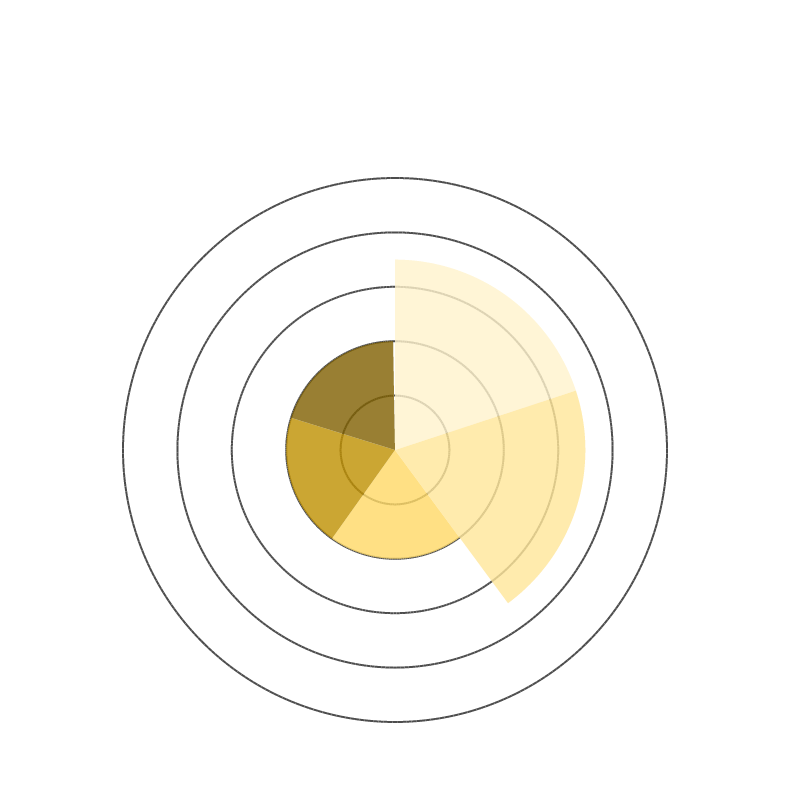
| Category | Biogasproductie | Groengasproductie | Gas-aansluiting | Spui/Affakkeling | Gasopslag |
|---|---|---|---|---|---|
| 0 | 7 | 0 | 0 | 0 | 0 |
| 1 | 7 | 0 | 0 | 0 | 0 |
| 2 | 7 | 0 | 0 | 0 | 0 |
| 3 | 7 | 0 | 0 | 0 | 0 |
| 4 | 7 | 0 | 0 | 0 | 0 |
| 5 | 7 | 0 | 0 | 0 | 0 |
| 6 | 7 | 0 | 0 | 0 | 0 |
| 7 | 7 | 0 | 0 | 0 | 0 |
| 8 | 7 | 0 | 0 | 0 | 0 |
| 9 | 7 | 0 | 0 | 0 | 0 |
| 10 | 7 | 0 | 0 | 0 | 0 |
| 11 | 7 | 0 | 0 | 0 | 0 |
| 12 | 7 | 0 | 0 | 0 | 0 |
| 13 | 7 | 0 | 0 | 0 | 0 |
| 14 | 7 | 0 | 0 | 0 | 0 |
| 15 | 7 | 0 | 0 | 0 | 0 |
| 16 | 7 | 0 | 0 | 0 | 0 |
| 17 | 7 | 0 | 0 | 0 | 0 |
| 18 | 7 | 0 | 0 | 0 | 0 |
| 19 | 7 | 0 | 0 | 0 | 0 |
| 20 | 7 | 0 | 0 | 0 | 0 |
| 21 | 7 | 0 | 0 | 0 | 0 |
| 22 | 7 | 0 | 0 | 0 | 0 |
| 23 | 7 | 0 | 0 | 0 | 0 |
| 24 | 7 | 0 | 0 | 0 | 0 |
| 25 | 7 | 0 | 0 | 0 | 0 |
| 26 | 7 | 0 | 0 | 0 | 0 |
| 27 | 7 | 0 | 0 | 0 | 0 |
| 28 | 7 | 0 | 0 | 0 | 0 |
| 29 | 7 | 0 | 0 | 0 | 0 |
| 30 | 7 | 0 | 0 | 0 | 0 |
| 31 | 7 | 0 | 0 | 0 | 0 |
| 32 | 7 | 0 | 0 | 0 | 0 |
| 33 | 7 | 0 | 0 | 0 | 0 |
| 34 | 7 | 0 | 0 | 0 | 0 |
| 35 | 7 | 0 | 0 | 0 | 0 |
| 36 | 7 | 0 | 0 | 0 | 0 |
| 37 | 7 | 0 | 0 | 0 | 0 |
| 38 | 7 | 0 | 0 | 0 | 0 |
| 39 | 7 | 0 | 0 | 0 | 0 |
| 40 | 7 | 0 | 0 | 0 | 0 |
| 41 | 7 | 0 | 0 | 0 | 0 |
| 42 | 7 | 0 | 0 | 0 | 0 |
| 43 | 7 | 0 | 0 | 0 | 0 |
| 44 | 7 | 0 | 0 | 0 | 0 |
| 45 | 7 | 0 | 0 | 0 | 0 |
| 46 | 7 | 0 | 0 | 0 | 0 |
| 47 | 7 | 0 | 0 | 0 | 0 |
| 48 | 7 | 0 | 0 | 0 | 0 |
| 49 | 7 | 0 | 0 | 0 | 0 |
| 50 | 7 | 0 | 0 | 0 | 0 |
| 51 | 7 | 0 | 0 | 0 | 0 |
| 52 | 7 | 0 | 0 | 0 | 0 |
| 53 | 7 | 0 | 0 | 0 | 0 |
| 54 | 7 | 0 | 0 | 0 | 0 |
| 55 | 7 | 0 | 0 | 0 | 0 |
| 56 | 7 | 0 | 0 | 0 | 0 |
| 57 | 7 | 0 | 0 | 0 | 0 |
| 58 | 7 | 0 | 0 | 0 | 0 |
| 59 | 7 | 0 | 0 | 0 | 0 |
| 60 | 7 | 0 | 0 | 0 | 0 |
| 61 | 7 | 0 | 0 | 0 | 0 |
| 62 | 7 | 0 | 0 | 0 | 0 |
| 63 | 7 | 0 | 0 | 0 | 0 |
| 64 | 7 | 0 | 0 | 0 | 0 |
| 65 | 7 | 0 | 0 | 0 | 0 |
| 66 | 7 | 0 | 0 | 0 | 0 |
| 67 | 7 | 0 | 0 | 0 | 0 |
| 68 | 7 | 0 | 0 | 0 | 0 |
| 69 | 7 | 0 | 0 | 0 | 0 |
| 70 | 7 | 0 | 0 | 0 | 0 |
| 71 | 7 | 0 | 0 | 0 | 0 |
| 72 | 7 | 7 | 0 | 0 | 0 |
| 73 | 0 | 7 | 0 | 0 | 0 |
| 74 | 0 | 7 | 0 | 0 | 0 |
| 75 | 0 | 7 | 0 | 0 | 0 |
| 76 | 0 | 7 | 0 | 0 | 0 |
| 77 | 0 | 7 | 0 | 0 | 0 |
| 78 | 0 | 7 | 0 | 0 | 0 |
| 79 | 0 | 7 | 0 | 0 | 0 |
| 80 | 0 | 7 | 0 | 0 | 0 |
| 81 | 0 | 7 | 0 | 0 | 0 |
| 82 | 0 | 7 | 0 | 0 | 0 |
| 83 | 0 | 7 | 0 | 0 | 0 |
| 84 | 0 | 7 | 0 | 0 | 0 |
| 85 | 0 | 7 | 0 | 0 | 0 |
| 86 | 0 | 7 | 0 | 0 | 0 |
| 87 | 0 | 7 | 0 | 0 | 0 |
| 88 | 0 | 7 | 0 | 0 | 0 |
| 89 | 0 | 7 | 0 | 0 | 0 |
| 90 | 0 | 7 | 0 | 0 | 0 |
| 91 | 0 | 7 | 0 | 0 | 0 |
| 92 | 0 | 7 | 0 | 0 | 0 |
| 93 | 0 | 7 | 0 | 0 | 0 |
| 94 | 0 | 7 | 0 | 0 | 0 |
| 95 | 0 | 7 | 0 | 0 | 0 |
| 96 | 0 | 7 | 0 | 0 | 0 |
| 97 | 0 | 7 | 0 | 0 | 0 |
| 98 | 0 | 7 | 0 | 0 | 0 |
| 99 | 0 | 7 | 0 | 0 | 0 |
| 100 | 0 | 7 | 0 | 0 | 0 |
| 101 | 0 | 7 | 0 | 0 | 0 |
| 102 | 0 | 7 | 0 | 0 | 0 |
| 103 | 0 | 7 | 0 | 0 | 0 |
| 104 | 0 | 7 | 0 | 0 | 0 |
| 105 | 0 | 7 | 0 | 0 | 0 |
| 106 | 0 | 7 | 0 | 0 | 0 |
| 107 | 0 | 7 | 0 | 0 | 0 |
| 108 | 0 | 7 | 0 | 0 | 0 |
| 109 | 0 | 7 | 0 | 0 | 0 |
| 110 | 0 | 7 | 0 | 0 | 0 |
| 111 | 0 | 7 | 0 | 0 | 0 |
| 112 | 0 | 7 | 0 | 0 | 0 |
| 113 | 0 | 7 | 0 | 0 | 0 |
| 114 | 0 | 7 | 0 | 0 | 0 |
| 115 | 0 | 7 | 0 | 0 | 0 |
| 116 | 0 | 7 | 0 | 0 | 0 |
| 117 | 0 | 7 | 0 | 0 | 0 |
| 118 | 0 | 7 | 0 | 0 | 0 |
| 119 | 0 | 7 | 0 | 0 | 0 |
| 120 | 0 | 7 | 0 | 0 | 0 |
| 121 | 0 | 7 | 0 | 0 | 0 |
| 122 | 0 | 7 | 0 | 0 | 0 |
| 123 | 0 | 7 | 0 | 0 | 0 |
| 124 | 0 | 7 | 0 | 0 | 0 |
| 125 | 0 | 7 | 0 | 0 | 0 |
| 126 | 0 | 7 | 0 | 0 | 0 |
| 127 | 0 | 7 | 0 | 0 | 0 |
| 128 | 0 | 7 | 0 | 0 | 0 |
| 129 | 0 | 7 | 0 | 0 | 0 |
| 130 | 0 | 7 | 0 | 0 | 0 |
| 131 | 0 | 7 | 0 | 0 | 0 |
| 132 | 0 | 7 | 0 | 0 | 0 |
| 133 | 0 | 7 | 0 | 0 | 0 |
| 134 | 0 | 7 | 0 | 0 | 0 |
| 135 | 0 | 7 | 0 | 0 | 0 |
| 136 | 0 | 7 | 0 | 0 | 0 |
| 137 | 0 | 7 | 0 | 0 | 0 |
| 138 | 0 | 7 | 0 | 0 | 0 |
| 139 | 0 | 7 | 0 | 0 | 0 |
| 140 | 0 | 7 | 0 | 0 | 0 |
| 141 | 0 | 7 | 0 | 0 | 0 |
| 142 | 0 | 7 | 0 | 0 | 0 |
| 143 | 0 | 7 | 0 | 0 | 0 |
| 144 | 0 | 7 | 4 | 0 | 0 |
| 145 | 0 | 0 | 4 | 0 | 0 |
| 146 | 0 | 0 | 4 | 0 | 0 |
| 147 | 0 | 0 | 4 | 0 | 0 |
| 148 | 0 | 0 | 4 | 0 | 0 |
| 149 | 0 | 0 | 4 | 0 | 0 |
| 150 | 0 | 0 | 4 | 0 | 0 |
| 151 | 0 | 0 | 4 | 0 | 0 |
| 152 | 0 | 0 | 4 | 0 | 0 |
| 153 | 0 | 0 | 4 | 0 | 0 |
| 154 | 0 | 0 | 4 | 0 | 0 |
| 155 | 0 | 0 | 4 | 0 | 0 |
| 156 | 0 | 0 | 4 | 0 | 0 |
| 157 | 0 | 0 | 4 | 0 | 0 |
| 158 | 0 | 0 | 4 | 0 | 0 |
| 159 | 0 | 0 | 4 | 0 | 0 |
| 160 | 0 | 0 | 4 | 0 | 0 |
| 161 | 0 | 0 | 4 | 0 | 0 |
| 162 | 0 | 0 | 4 | 0 | 0 |
| 163 | 0 | 0 | 4 | 0 | 0 |
| 164 | 0 | 0 | 4 | 0 | 0 |
| 165 | 0 | 0 | 4 | 0 | 0 |
| 166 | 0 | 0 | 4 | 0 | 0 |
| 167 | 0 | 0 | 4 | 0 | 0 |
| 168 | 0 | 0 | 4 | 0 | 0 |
| 169 | 0 | 0 | 4 | 0 | 0 |
| 170 | 0 | 0 | 4 | 0 | 0 |
| 171 | 0 | 0 | 4 | 0 | 0 |
| 172 | 0 | 0 | 4 | 0 | 0 |
| 173 | 0 | 0 | 4 | 0 | 0 |
| 174 | 0 | 0 | 4 | 0 | 0 |
| 175 | 0 | 0 | 4 | 0 | 0 |
| 176 | 0 | 0 | 4 | 0 | 0 |
| 177 | 0 | 0 | 4 | 0 | 0 |
| 178 | 0 | 0 | 4 | 0 | 0 |
| 179 | 0 | 0 | 4 | 0 | 0 |
| 180 | 0 | 0 | 4 | 0 | 0 |
| 181 | 0 | 0 | 4 | 0 | 0 |
| 182 | 0 | 0 | 4 | 0 | 0 |
| 183 | 0 | 0 | 4 | 0 | 0 |
| 184 | 0 | 0 | 4 | 0 | 0 |
| 185 | 0 | 0 | 4 | 0 | 0 |
| 186 | 0 | 0 | 4 | 0 | 0 |
| 187 | 0 | 0 | 4 | 0 | 0 |
| 188 | 0 | 0 | 4 | 0 | 0 |
| 189 | 0 | 0 | 4 | 0 | 0 |
| 190 | 0 | 0 | 4 | 0 | 0 |
| 191 | 0 | 0 | 4 | 0 | 0 |
| 192 | 0 | 0 | 4 | 0 | 0 |
| 193 | 0 | 0 | 4 | 0 | 0 |
| 194 | 0 | 0 | 4 | 0 | 0 |
| 195 | 0 | 0 | 4 | 0 | 0 |
| 196 | 0 | 0 | 4 | 0 | 0 |
| 197 | 0 | 0 | 4 | 0 | 0 |
| 198 | 0 | 0 | 4 | 0 | 0 |
| 199 | 0 | 0 | 4 | 0 | 0 |
| 200 | 0 | 0 | 4 | 0 | 0 |
| 201 | 0 | 0 | 4 | 0 | 0 |
| 202 | 0 | 0 | 4 | 0 | 0 |
| 203 | 0 | 0 | 4 | 0 | 0 |
| 204 | 0 | 0 | 4 | 0 | 0 |
| 205 | 0 | 0 | 4 | 0 | 0 |
| 206 | 0 | 0 | 4 | 0 | 0 |
| 207 | 0 | 0 | 4 | 0 | 0 |
| 208 | 0 | 0 | 4 | 0 | 0 |
| 209 | 0 | 0 | 4 | 0 | 0 |
| 210 | 0 | 0 | 4 | 0 | 0 |
| 211 | 0 | 0 | 4 | 0 | 0 |
| 212 | 0 | 0 | 4 | 0 | 0 |
| 213 | 0 | 0 | 4 | 0 | 0 |
| 214 | 0 | 0 | 4 | 0 | 0 |
| 215 | 0 | 0 | 4 | 0 | 0 |
| 216 | 0 | 0 | 4 | 4 | 0 |
| 217 | 0 | 0 | 0 | 4 | 0 |
| 218 | 0 | 0 | 0 | 4 | 0 |
| 219 | 0 | 0 | 0 | 4 | 0 |
| 220 | 0 | 0 | 0 | 4 | 0 |
| 221 | 0 | 0 | 0 | 4 | 0 |
| 222 | 0 | 0 | 0 | 4 | 0 |
| 223 | 0 | 0 | 0 | 4 | 0 |
| 224 | 0 | 0 | 0 | 4 | 0 |
| 225 | 0 | 0 | 0 | 4 | 0 |
| 226 | 0 | 0 | 0 | 4 | 0 |
| 227 | 0 | 0 | 0 | 4 | 0 |
| 228 | 0 | 0 | 0 | 4 | 0 |
| 229 | 0 | 0 | 0 | 4 | 0 |
| 230 | 0 | 0 | 0 | 4 | 0 |
| 231 | 0 | 0 | 0 | 4 | 0 |
| 232 | 0 | 0 | 0 | 4 | 0 |
| 233 | 0 | 0 | 0 | 4 | 0 |
| 234 | 0 | 0 | 0 | 4 | 0 |
| 235 | 0 | 0 | 0 | 4 | 0 |
| 236 | 0 | 0 | 0 | 4 | 0 |
| 237 | 0 | 0 | 0 | 4 | 0 |
| 238 | 0 | 0 | 0 | 4 | 0 |
| 239 | 0 | 0 | 0 | 4 | 0 |
| 240 | 0 | 0 | 0 | 4 | 0 |
| 241 | 0 | 0 | 0 | 4 | 0 |
| 242 | 0 | 0 | 0 | 4 | 0 |
| 243 | 0 | 0 | 0 | 4 | 0 |
| 244 | 0 | 0 | 0 | 4 | 0 |
| 245 | 0 | 0 | 0 | 4 | 0 |
| 246 | 0 | 0 | 0 | 4 | 0 |
| 247 | 0 | 0 | 0 | 4 | 0 |
| 248 | 0 | 0 | 0 | 4 | 0 |
| 249 | 0 | 0 | 0 | 4 | 0 |
| 250 | 0 | 0 | 0 | 4 | 0 |
| 251 | 0 | 0 | 0 | 4 | 0 |
| 252 | 0 | 0 | 0 | 4 | 0 |
| 253 | 0 | 0 | 0 | 4 | 0 |
| 254 | 0 | 0 | 0 | 4 | 0 |
| 255 | 0 | 0 | 0 | 4 | 0 |
| 256 | 0 | 0 | 0 | 4 | 0 |
| 257 | 0 | 0 | 0 | 4 | 0 |
| 258 | 0 | 0 | 0 | 4 | 0 |
| 259 | 0 | 0 | 0 | 4 | 0 |
| 260 | 0 | 0 | 0 | 4 | 0 |
| 261 | 0 | 0 | 0 | 4 | 0 |
| 262 | 0 | 0 | 0 | 4 | 0 |
| 263 | 0 | 0 | 0 | 4 | 0 |
| 264 | 0 | 0 | 0 | 4 | 0 |
| 265 | 0 | 0 | 0 | 4 | 0 |
| 266 | 0 | 0 | 0 | 4 | 0 |
| 267 | 0 | 0 | 0 | 4 | 0 |
| 268 | 0 | 0 | 0 | 4 | 0 |
| 269 | 0 | 0 | 0 | 4 | 0 |
| 270 | 0 | 0 | 0 | 4 | 0 |
| 271 | 0 | 0 | 0 | 4 | 0 |
| 272 | 0 | 0 | 0 | 4 | 0 |
| 273 | 0 | 0 | 0 | 4 | 0 |
| 274 | 0 | 0 | 0 | 4 | 0 |
| 275 | 0 | 0 | 0 | 4 | 0 |
| 276 | 0 | 0 | 0 | 4 | 0 |
| 277 | 0 | 0 | 0 | 4 | 0 |
| 278 | 0 | 0 | 0 | 4 | 0 |
| 279 | 0 | 0 | 0 | 4 | 0 |
| 280 | 0 | 0 | 0 | 4 | 0 |
| 281 | 0 | 0 | 0 | 4 | 0 |
| 282 | 0 | 0 | 0 | 4 | 0 |
| 283 | 0 | 0 | 0 | 4 | 0 |
| 284 | 0 | 0 | 0 | 4 | 0 |
| 285 | 0 | 0 | 0 | 4 | 0 |
| 286 | 0 | 0 | 0 | 4 | 0 |
| 287 | 0 | 0 | 0 | 4 | 0 |
| 288 | 0 | 0 | 0 | 4 | 0 |
| 289 | 0 | 0 | 0 | 0 | 0 |
| 290 | 0 | 0 | 0 | 0 | 0 |
| 291 | 0 | 0 | 0 | 0 | 0 |
| 292 | 0 | 0 | 0 | 0 | 0 |
| 293 | 0 | 0 | 0 | 0 | 0 |
| 294 | 0 | 0 | 0 | 0 | 0 |
| 295 | 0 | 0 | 0 | 0 | 0 |
| 296 | 0 | 0 | 0 | 0 | 0 |
| 297 | 0 | 0 | 0 | 0 | 0 |
| 298 | 0 | 0 | 0 | 0 | 0 |
| 299 | 0 | 0 | 0 | 0 | 0 |
| 300 | 0 | 0 | 0 | 0 | 0 |
| 301 | 0 | 0 | 0 | 0 | 0 |
| 302 | 0 | 0 | 0 | 0 | 0 |
| 303 | 0 | 0 | 0 | 0 | 0 |
| 304 | 0 | 0 | 0 | 0 | 0 |
| 305 | 0 | 0 | 0 | 0 | 0 |
| 306 | 0 | 0 | 0 | 0 | 0 |
| 307 | 0 | 0 | 0 | 0 | 0 |
| 308 | 0 | 0 | 0 | 0 | 0 |
| 309 | 0 | 0 | 0 | 0 | 0 |
| 310 | 0 | 0 | 0 | 0 | 0 |
| 311 | 0 | 0 | 0 | 0 | 0 |
| 312 | 0 | 0 | 0 | 0 | 0 |
| 313 | 0 | 0 | 0 | 0 | 0 |
| 314 | 0 | 0 | 0 | 0 | 0 |
| 315 | 0 | 0 | 0 | 0 | 0 |
| 316 | 0 | 0 | 0 | 0 | 0 |
| 317 | 0 | 0 | 0 | 0 | 0 |
| 318 | 0 | 0 | 0 | 0 | 0 |
| 319 | 0 | 0 | 0 | 0 | 0 |
| 320 | 0 | 0 | 0 | 0 | 0 |
| 321 | 0 | 0 | 0 | 0 | 0 |
| 322 | 0 | 0 | 0 | 0 | 0 |
| 323 | 0 | 0 | 0 | 0 | 0 |
| 324 | 0 | 0 | 0 | 0 | 0 |
| 325 | 0 | 0 | 0 | 0 | 0 |
| 326 | 0 | 0 | 0 | 0 | 0 |
| 327 | 0 | 0 | 0 | 0 | 0 |
| 328 | 0 | 0 | 0 | 0 | 0 |
| 329 | 0 | 0 | 0 | 0 | 0 |
| 330 | 0 | 0 | 0 | 0 | 0 |
| 331 | 0 | 0 | 0 | 0 | 0 |
| 332 | 0 | 0 | 0 | 0 | 0 |
| 333 | 0 | 0 | 0 | 0 | 0 |
| 334 | 0 | 0 | 0 | 0 | 0 |
| 335 | 0 | 0 | 0 | 0 | 0 |
| 336 | 0 | 0 | 0 | 0 | 0 |
| 337 | 0 | 0 | 0 | 0 | 0 |
| 338 | 0 | 0 | 0 | 0 | 0 |
| 339 | 0 | 0 | 0 | 0 | 0 |
| 340 | 0 | 0 | 0 | 0 | 0 |
| 341 | 0 | 0 | 0 | 0 | 0 |
| 342 | 0 | 0 | 0 | 0 | 0 |
| 343 | 0 | 0 | 0 | 0 | 0 |
| 344 | 0 | 0 | 0 | 0 | 0 |
| 345 | 0 | 0 | 0 | 0 | 0 |
| 346 | 0 | 0 | 0 | 0 | 0 |
| 347 | 0 | 0 | 0 | 0 | 0 |
| 348 | 0 | 0 | 0 | 0 | 0 |
| 349 | 0 | 0 | 0 | 0 | 0 |
| 350 | 0 | 0 | 0 | 0 | 0 |
| 351 | 0 | 0 | 0 | 0 | 0 |
| 352 | 0 | 0 | 0 | 0 | 0 |
| 353 | 0 | 0 | 0 | 0 | 0 |
| 354 | 0 | 0 | 0 | 0 | 0 |
| 355 | 0 | 0 | 0 | 0 | 0 |
| 356 | 0 | 0 | 0 | 0 | 0 |
| 357 | 0 | 0 | 0 | 0 | 0 |
| 358 | 0 | 0 | 0 | 0 | 0 |
| 359 | 0 | 0 | 0 | 0 | 0 |
| 360 | 0 | 0 | 0 | 0 | 10 |